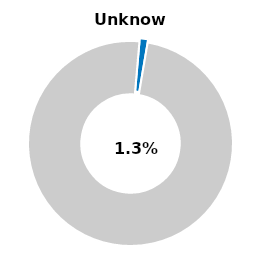
| Category | Series 0 |
|---|---|
| Unknown | 0.013 |
| Other | 0.987 |